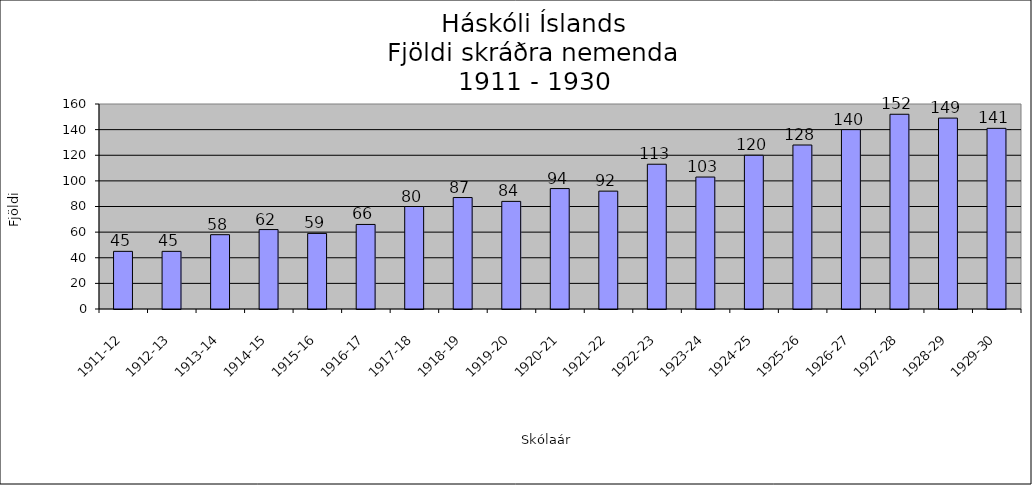
| Category | Series 0 |
|---|---|
| 1911-12 | 45 |
| 1912-13 | 45 |
| 1913-14 | 58 |
| 1914-15 | 62 |
| 1915-16 | 59 |
| 1916-17 | 66 |
| 1917-18 | 80 |
| 1918-19 | 87 |
| 1919-20 | 84 |
| 1920-21 | 94 |
| 1921-22 | 92 |
| 1922-23 | 113 |
| 1923-24 | 103 |
| 1924-25 | 120 |
| 1925-26 | 128 |
| 1926-27 | 140 |
| 1927-28 | 152 |
| 1928-29 | 149 |
| 1929-30 | 141 |